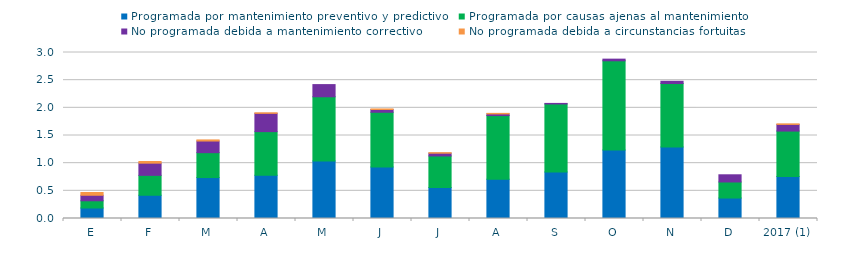
| Category | Programada por mantenimiento preventivo y predictivo | Programada por causas ajenas al mantenimiento  | No programada debida a mantenimiento correctivo  | No programada debida a circunstancias fortuitas  |
|---|---|---|---|---|
| E | 0.19 | 0.13 | 0.1 | 0.05 |
| F | 0.42 | 0.36 | 0.22 | 0.03 |
| M | 0.74 | 0.45 | 0.21 | 0.02 |
| A | 0.78 | 0.79 | 0.33 | 0.01 |
| M | 1.04 | 1.16 | 0.22 | 0 |
| J | 0.93 | 0.99 | 0.05 | 0.01 |
| J | 0.56 | 0.57 | 0.05 | 0.01 |
| A | 0.71 | 1.15 | 0.03 | 0.01 |
| S | 0.84 | 1.23 | 0.01 | 0 |
| O | 1.24 | 1.61 | 0.03 | 0 |
| N | 1.29 | 1.15 | 0.04 | 0 |
| D | 0.37 | 0.29 | 0.13 | 0 |
| 2017 (1) | 0.76 | 0.82 | 0.12 | 0.01 |